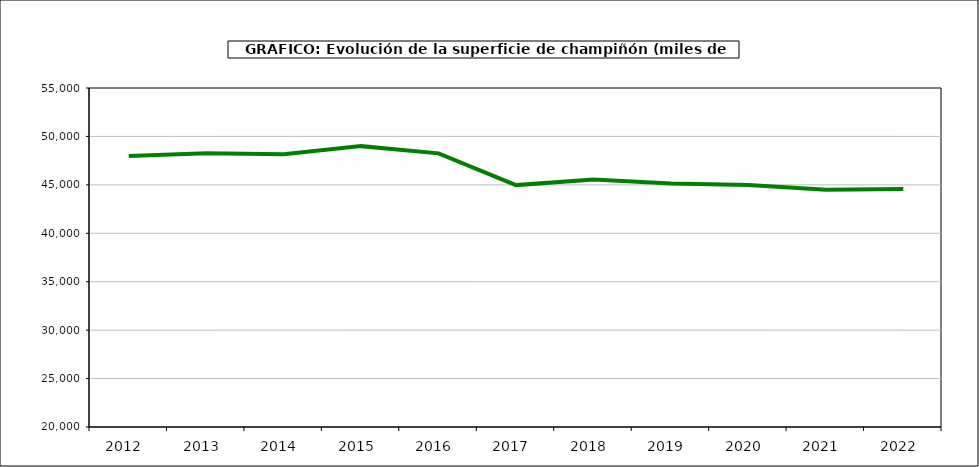
| Category | superficie |
|---|---|
| 2012.0 | 47970 |
| 2013.0 | 48261 |
| 2014.0 | 48171 |
| 2015.0 | 48998 |
| 2016.0 | 48254 |
| 2017.0 | 44974 |
| 2018.0 | 45565 |
| 2019.0 | 45141 |
| 2020.0 | 44992 |
| 2021.0 | 44489 |
| 2022.0 | 44574 |